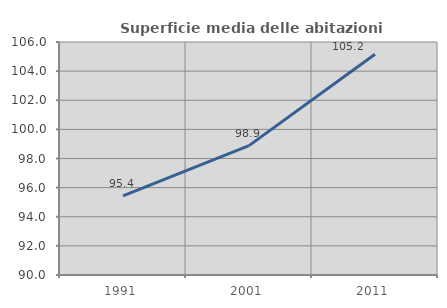
| Category | Superficie media delle abitazioni occupate |
|---|---|
| 1991.0 | 95.429 |
| 2001.0 | 98.886 |
| 2011.0 | 105.158 |